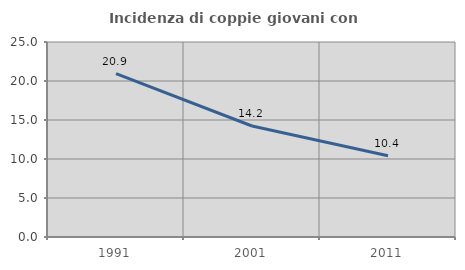
| Category | Incidenza di coppie giovani con figli |
|---|---|
| 1991.0 | 20.94 |
| 2001.0 | 14.234 |
| 2011.0 | 10.423 |